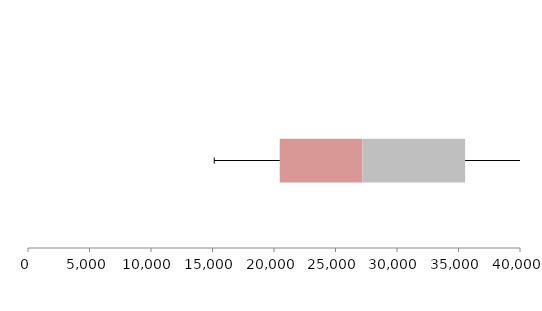
| Category | Series 1 | Series 2 | Series 3 |
|---|---|---|---|
| 0 | 20468.248 | 6714.769 | 8353.561 |